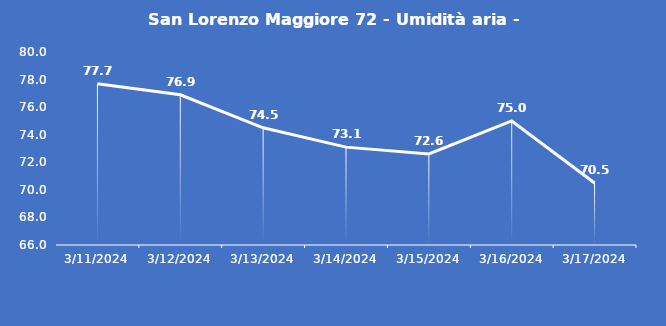
| Category | San Lorenzo Maggiore 72 - Umidità aria - Grezzo (%) |
|---|---|
| 3/11/24 | 77.7 |
| 3/12/24 | 76.9 |
| 3/13/24 | 74.5 |
| 3/14/24 | 73.1 |
| 3/15/24 | 72.6 |
| 3/16/24 | 75 |
| 3/17/24 | 70.5 |